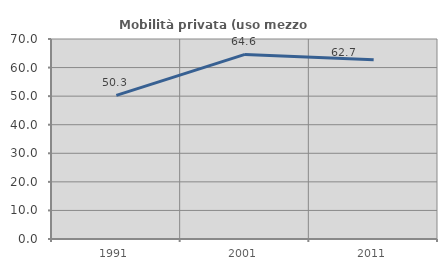
| Category | Mobilità privata (uso mezzo privato) |
|---|---|
| 1991.0 | 50.254 |
| 2001.0 | 64.607 |
| 2011.0 | 62.712 |